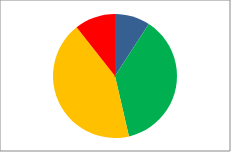
| Category | Series 0 | Series 1 |
|---|---|---|
| Outstanding | 19 | 0.092 |
| Good | 77 | 0.372 |
| RI | 89 | 0.43 |
| Inadequate | 22 | 0.106 |